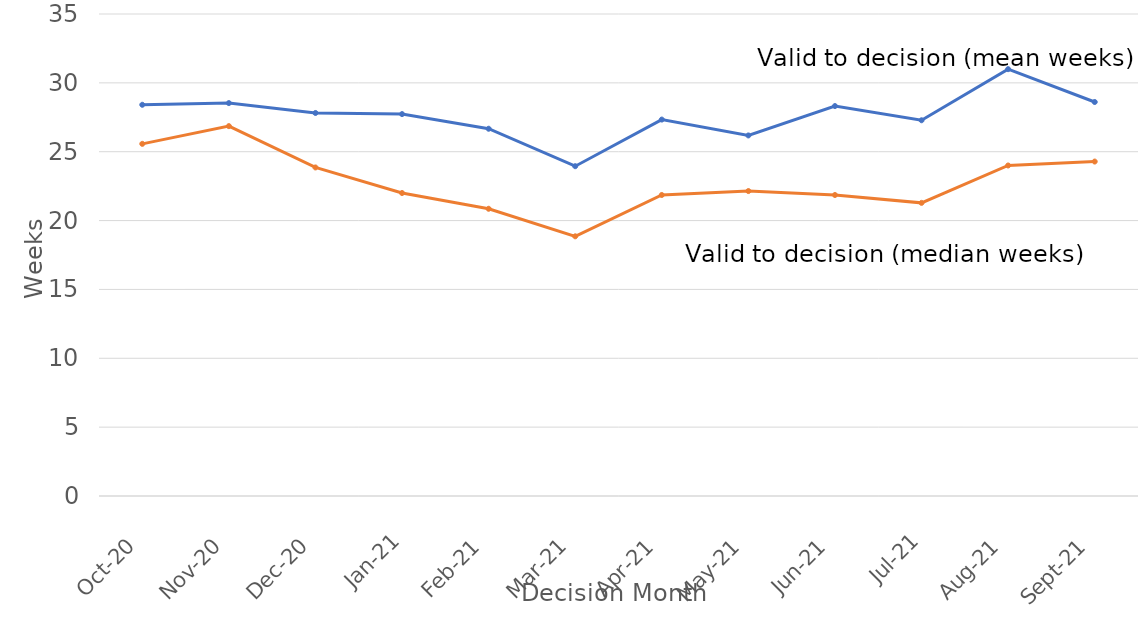
| Category | Valid to Decision  (mean weeks) | Valid to Decision  (median weeks) |
|---|---|---|
| 2020-10-01 | 28.409 | 25.571 |
| 2020-11-01 | 28.531 | 26.857 |
| 2020-12-01 | 27.813 | 23.857 |
| 2021-01-01 | 27.732 | 22 |
| 2021-02-01 | 26.669 | 20.857 |
| 2021-03-01 | 23.948 | 18.857 |
| 2021-04-01 | 27.335 | 21.857 |
| 2021-05-01 | 26.182 | 22.143 |
| 2021-06-01 | 28.315 | 21.857 |
| 2021-07-01 | 27.284 | 21.286 |
| 2021-08-01 | 30.994 | 24 |
| 2021-09-01 | 28.61 | 24.286 |